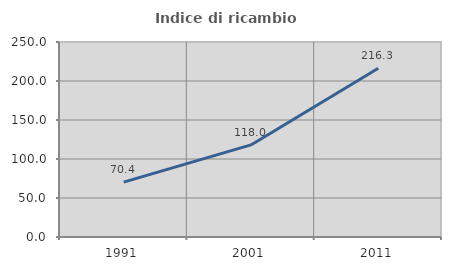
| Category | Indice di ricambio occupazionale  |
|---|---|
| 1991.0 | 70.385 |
| 2001.0 | 118.041 |
| 2011.0 | 216.34 |